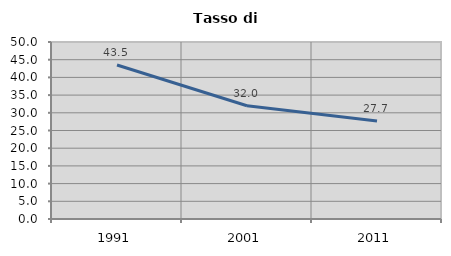
| Category | Tasso di disoccupazione   |
|---|---|
| 1991.0 | 43.514 |
| 2001.0 | 32 |
| 2011.0 | 27.703 |